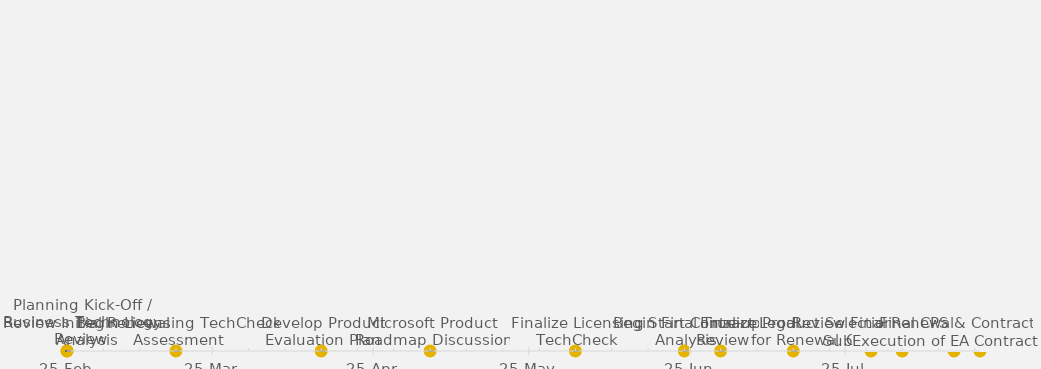
| Category | POSITION |
|---|---|
| Planning Kick-Off / Business Technology Review | 0 |
| Review Initial Renewal Analysis | 0 |
| Begin Licensing TechCheck Assessment | 0 |
| Develop Product Evaluation Plan | 0 |
| Microsoft Product Roadmap Discussion | 0 |
| Finalize Licensing TechCheck | 0 |
| Begin Final True-up Analysis | 0 |
| Start Contract Legal Review | 0 |
| Finalize Product Selection for Renewal | 0 |
| Review Final Renewal Quotes | 0 |
| Submit Final True-Up | 0 |
| Final CPS & Contract Creation | 0 |
| Execution of EA Contract | 0 |